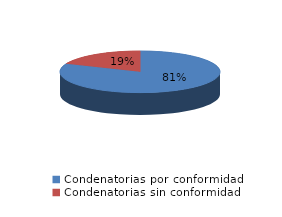
| Category | Series 0 |
|---|---|
| 0 | 96 |
| 1 | 22 |